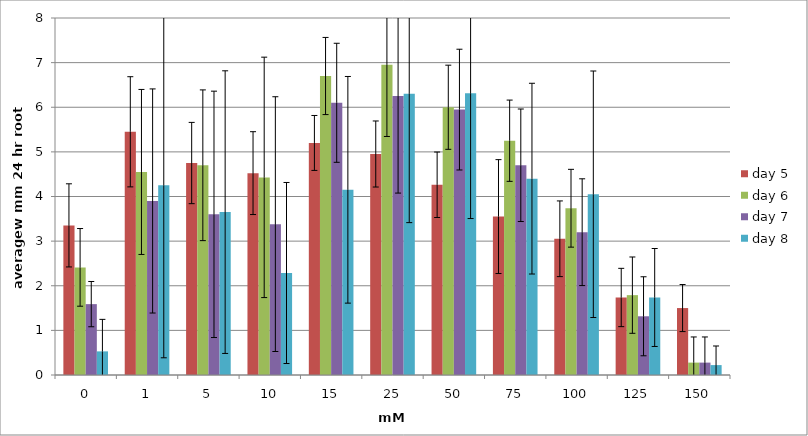
| Category | day 5 | day 6 | day 7 | day 8 |
|---|---|---|---|---|
| 0.0 | 3.353 | 2.412 | 1.588 | 0.529 |
| 1.0 | 5.45 | 4.55 | 3.9 | 4.25 |
| 5.0 | 4.75 | 4.7 | 3.6 | 3.65 |
| 10.0 | 4.524 | 4.429 | 3.381 | 2.286 |
| 15.0 | 5.2 | 6.7 | 6.1 | 4.15 |
| 25.0 | 4.952 | 6.95 | 6.25 | 6.3 |
| 50.0 | 4.263 | 6 | 5.947 | 6.316 |
| 75.0 | 3.55 | 5.25 | 4.7 | 4.4 |
| 100.0 | 3.053 | 3.737 | 3.2 | 4.05 |
| 125.0 | 1.737 | 1.789 | 1.316 | 1.737 |
| 150.0 | 1.5 | 0.278 | 0.278 | 0.222 |